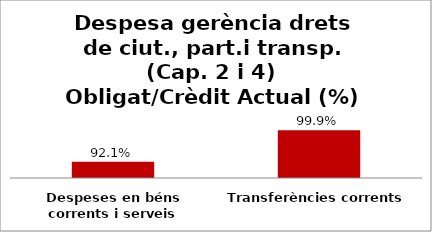
| Category | Series 0 |
|---|---|
| Despeses en béns corrents i serveis | 0.921 |
| Transferències corrents | 0.999 |